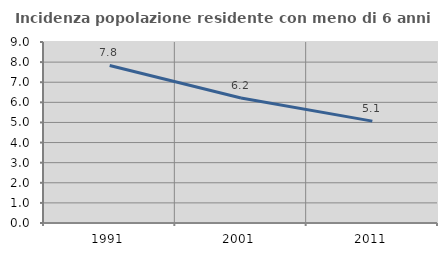
| Category | Incidenza popolazione residente con meno di 6 anni |
|---|---|
| 1991.0 | 7.835 |
| 2001.0 | 6.215 |
| 2011.0 | 5.066 |